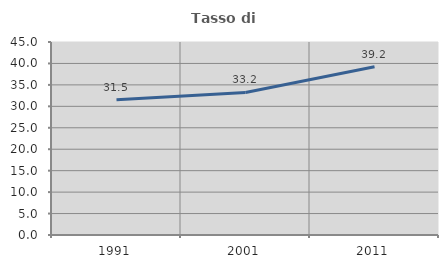
| Category | Tasso di occupazione   |
|---|---|
| 1991.0 | 31.509 |
| 2001.0 | 33.227 |
| 2011.0 | 39.207 |